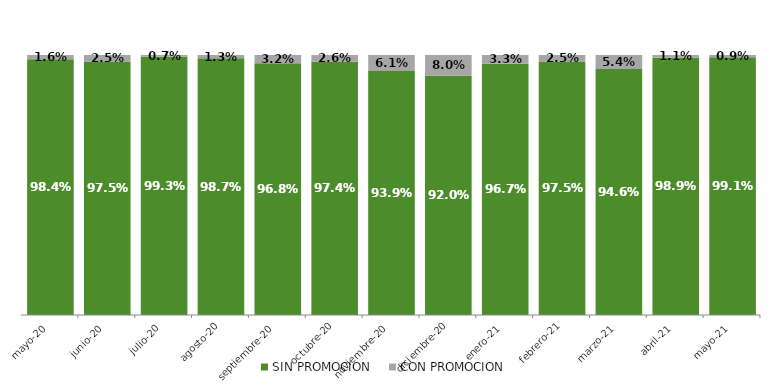
| Category | SIN PROMOCION   | CON PROMOCION   |
|---|---|---|
| 2020-05-01 | 0.984 | 0.016 |
| 2020-06-01 | 0.975 | 0.025 |
| 2020-07-01 | 0.993 | 0.007 |
| 2020-08-01 | 0.987 | 0.013 |
| 2020-09-01 | 0.968 | 0.032 |
| 2020-10-01 | 0.974 | 0.026 |
| 2020-11-01 | 0.939 | 0.061 |
| 2020-12-01 | 0.92 | 0.08 |
| 2021-01-01 | 0.967 | 0.033 |
| 2021-02-01 | 0.975 | 0.025 |
| 2021-03-01 | 0.946 | 0.054 |
| 2021-04-01 | 0.989 | 0.011 |
| 2021-05-01 | 0.991 | 0.009 |